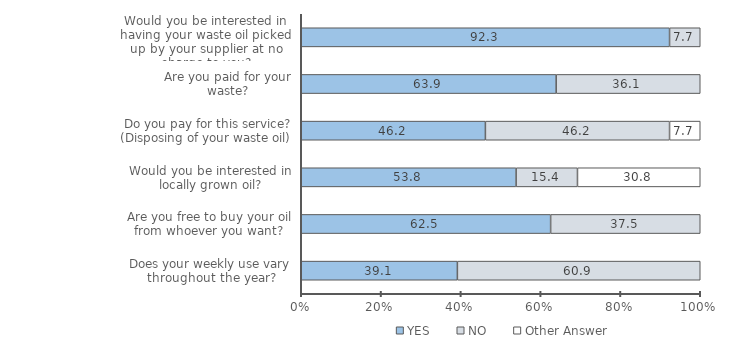
| Category | YES | NO | Other Answer |
|---|---|---|---|
| Does your weekly use vary throughout the year? | 39.13 | 60.87 | 0 |
| Are you free to buy your oil from whoever you want? | 62.5 | 37.5 | 0 |
| Would you be interested in locally grown oil? | 53.846 | 15.385 | 30.769 |
|  Do you pay for this service? (Disposing of your waste oil) | 46.154 | 46.154 | 7.692 |
| Are you paid for your waste? | 63.889 | 36.111 | 0 |
| Would you be interested in having your waste oil picked up by your supplier at no charge to you? | 92.308 | 7.692 | 0 |